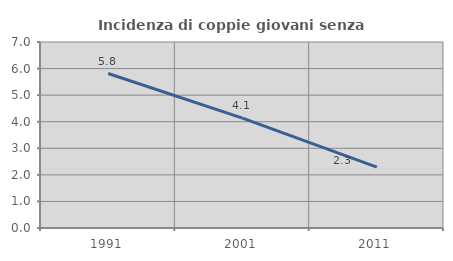
| Category | Incidenza di coppie giovani senza figli |
|---|---|
| 1991.0 | 5.814 |
| 2001.0 | 4.138 |
| 2011.0 | 2.29 |